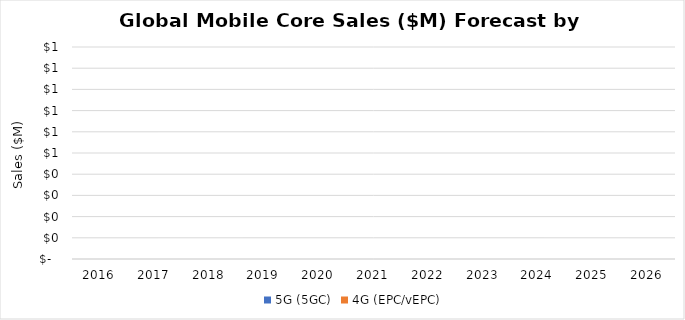
| Category | 5G (5GC) | 4G (EPC/vEPC) |
|---|---|---|
| 2016.0 | 0 | 0 |
| 2017.0 | 0 | 0 |
| 2018.0 | 0 | 0 |
| 2019.0 | 0 | 0 |
| 2020.0 | 0 | 0 |
| 2021.0 | 0 | 0 |
| 2022.0 | 0 | 0 |
| 2023.0 | 0 | 0 |
| 2024.0 | 0 | 0 |
| 2025.0 | 0 | 0 |
| 2026.0 | 0 | 0 |